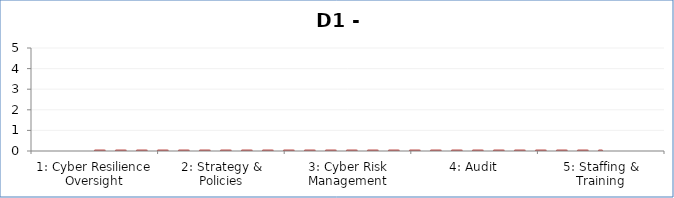
| Category | Assessment Factor Maturity |
|---|---|
| 1: Cyber Resilience Oversight | 0 |
| 2: Strategy & Policies | 0 |
| 3: Cyber Risk Management | 0 |
| 4: Audit | 0 |
| 5: Staffing & Training | 0 |